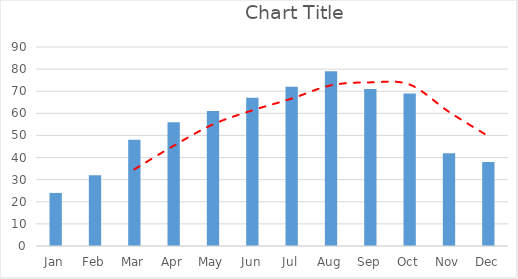
| Category | Series 0 |
|---|---|
| Jan | 24 |
| Feb | 32 |
| Mar | 48 |
| Apr | 56 |
| May | 61 |
| Jun | 67 |
| Jul | 72 |
| Aug | 79 |
| Sep | 71 |
| Oct | 69 |
| Nov | 42 |
| Dec | 38 |